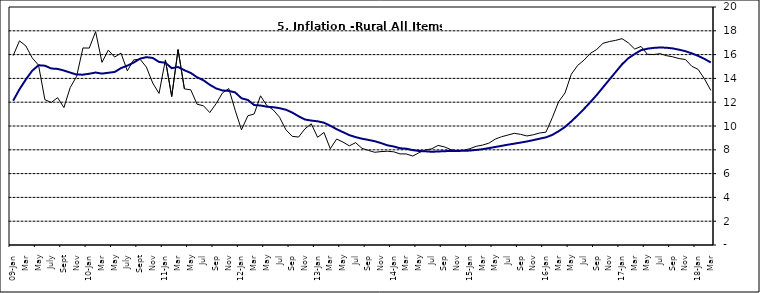
| Category | Series 0 | Series 1 |
|---|---|---|
| 09-Jan | 15.918 | 12.128 |
| Feb | 17.154 | 13.086 |
| Mar | 16.729 | 13.912 |
| Apr | 15.727 | 14.644 |
| May | 15.113 | 15.104 |
| June | 12.213 | 15.067 |
| July | 11.974 | 14.832 |
| Aug | 12.38 | 14.796 |
| Sept | 11.548 | 14.661 |
| Oct | 13.242 | 14.488 |
| Nov | 14.164 | 14.321 |
|  | 16.557 | 14.316 |
| 10-Jan | 16.548 | 14.39 |
| Feb | 17.934 | 14.494 |
| Mar | 15.346 | 14.401 |
| Apr | 16.373 | 14.473 |
| May | 15.794 | 14.54 |
| June | 16.126 | 14.862 |
| July | 14.634 | 15.072 |
| Aug | 15.556 | 15.33 |
| Sept | 15.616 | 15.658 |
| Oct | 14.955 | 15.786 |
| Nov | 13.616 | 15.719 |
| Dec | 12.735 | 15.385 |
| 11-Jan | 15.553 | 15.311 |
| Feb | 12.482 | 14.856 |
| Mar | 16.422 | 14.956 |
| Apr | 13.117 | 14.687 |
| May | 13.041 | 14.457 |
| Jun | 11.83 | 14.095 |
| Jul | 11.699 | 13.84 |
| Aug | 11.13 | 13.464 |
| Sep | 11.878 | 13.156 |
| Oct | 12.778 | 12.985 |
| Nov | 13.147 | 12.95 |
| Dec | 11.326 | 12.824 |
| 12-Jan | 9.678 | 12.33 |
| Feb | 10.856 | 12.188 |
| Mar | 11.014 | 11.76 |
| Apr | 12.536 | 11.724 |
| May | 11.712 | 11.621 |
| Jun | 11.36 | 11.582 |
| Jul | 10.733 | 11.499 |
| Aug | 9.683 | 11.368 |
| Sep | 9.132 | 11.131 |
| Oct | 9.071 | 10.82 |
| Nov | 9.758 | 10.548 |
| Dec | 10.183 | 10.455 |
| 13-Jan | 9.052 | 10.394 |
| Feb | 9.457 | 10.276 |
| Mar | 8.091 | 10.025 |
| Apr | 8.907 | 9.732 |
| May | 8.647 | 9.483 |
| Jun | 8.333 | 9.236 |
| Jul | 8.6 | 9.063 |
| Aug | 8.12 | 8.933 |
| Sep | 7.95 | 8.832 |
| Oct | 7.791 | 8.722 |
| Nov | 7.849 | 8.565 |
| Dec | 7.879 | 8.378 |
| 14-Jan | 7.832 | 8.277 |
| Feb | 7.657 | 8.13 |
| Mar | 7.65 | 8.092 |
| Apr | 7.473 | 7.973 |
| May | 7.761 | 7.901 |
| Jun | 7.98 | 7.874 |
| Jul | 8.086 | 7.834 |
| Aug | 8.368 | 7.858 |
| Sep | 8.244 | 7.883 |
| Oct | 8.019 | 7.903 |
| Nov | 7.898 | 7.906 |
| Dec | 7.955 | 7.913 |
| 15-Jan | 8.094 | 7.935 |
| Feb | 8.291 | 7.988 |
| Mar | 8.396 | 8.05 |
| Apr | 8.556 | 8.14 |
| May | 8.896 | 8.236 |
| Jun | 9.098 | 8.331 |
| Jul | 9.238 | 8.429 |
| Aug | 9.382 | 8.516 |
| Sep | 9.3 | 8.606 |
| Oct | 9.162 | 8.7 |
| Nov | 9.261 | 8.813 |
| Dec | 9.41 | 8.933 |
| 16-Jan | 9.48 | 9.047 |
| Feb | 10.692 | 9.249 |
| Mar | 12.038 | 9.559 |
| Apr | 12.767 | 9.917 |
| May | 14.349 | 10.384 |
| Jun | 15.088 | 10.897 |
| Jul | 15.533 | 11.433 |
| Aug | 16.103 | 12.002 |
| Sep | 16.428 | 12.601 |
| Oct | 16.947 | 13.25 |
| Nov | 17.099 | 13.898 |
| Dec | 17.195 | 14.54 |
| 17-Jan | 17.341 | 15.183 |
| Feb | 16.982 | 15.696 |
| Mar | 16.466 | 16.054 |
| Apr | 16.687 | 16.369 |
| May | 16.023 | 16.497 |
| Jun | 16.007 | 16.563 |
| Jul | 16.078 | 16.6 |
| Aug | 15.914 | 16.577 |
| Sep | 15.812 | 16.52 |
| Oct | 15.666 | 16.411 |
| Nov | 15.587 | 16.285 |
| Dec | 15.018 | 16.104 |
| 18-Jan | 14.756 | 15.892 |
| Feb | 13.957 | 15.638 |
| Mar | 12.987 | 15.339 |